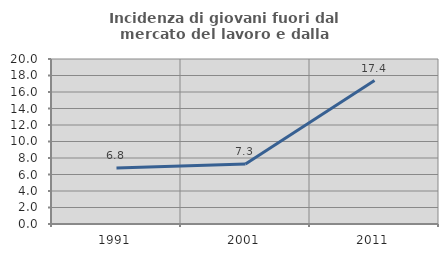
| Category | Incidenza di giovani fuori dal mercato del lavoro e dalla formazione  |
|---|---|
| 1991.0 | 6.796 |
| 2001.0 | 7.285 |
| 2011.0 | 17.391 |